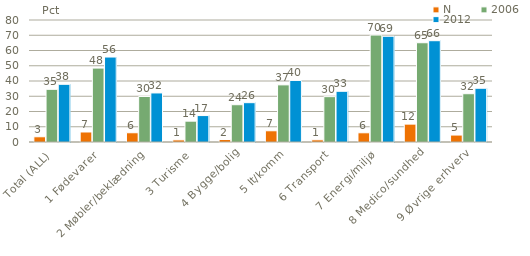
| Category | N | 2006 | 2012 |
|---|---|---|---|
| Total (ALL) | 3.426 | 34.541 | 37.838 |
| 1 Fødevarer | 6.56 | 48.462 | 55.715 |
| 2 Møbler/beklædning | 6.058 | 29.853 | 32.163 |
| 3 Turisme | 1.384 | 13.663 | 17.336 |
| 4 Bygge/bolig | 1.62 | 24.441 | 25.785 |
| 5 It/komm | 7.364 | 37.469 | 40.366 |
| 6 Transport | 1.433 | 29.728 | 33.255 |
| 7 Energi/miljø | 6.036 | 70.143 | 69.327 |
| 8 Medico/sundhed | 11.722 | 65.086 | 66.424 |
| 9 Øvrige erhverv | 4.557 | 31.653 | 35.242 |